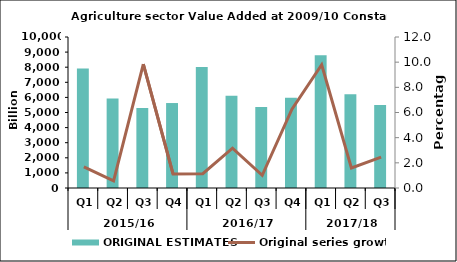
| Category | ORIGINAL ESTIMATES |
|---|---|
| 0 | 7920.036 |
| 1 | 5921.397 |
| 2 | 5305.395 |
| 3 | 5626.961 |
| 4 | 8010.354 |
| 5 | 6108.663 |
| 6 | 5358.873 |
| 7 | 5979.179 |
| 8 | 8795.147 |
| 9 | 6205.97 |
| 10 | 5489.985 |